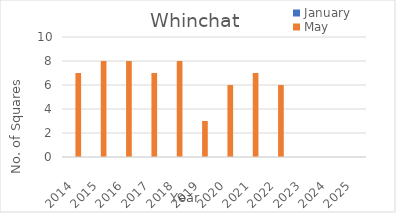
| Category | January | May |
|---|---|---|
| 2014.0 | 0 | 7 |
| 2015.0 | 0 | 8 |
| 2016.0 | 0 | 8 |
| 2017.0 | 0 | 7 |
| 2018.0 | 0 | 8 |
| 2019.0 | 0 | 3 |
| 2020.0 | 0 | 6 |
| 2021.0 | 0 | 7 |
| 2022.0 | 0 | 6 |
| 2023.0 | 0 | 0 |
| 2024.0 | 0 | 0 |
| 2025.0 | 0 | 0 |